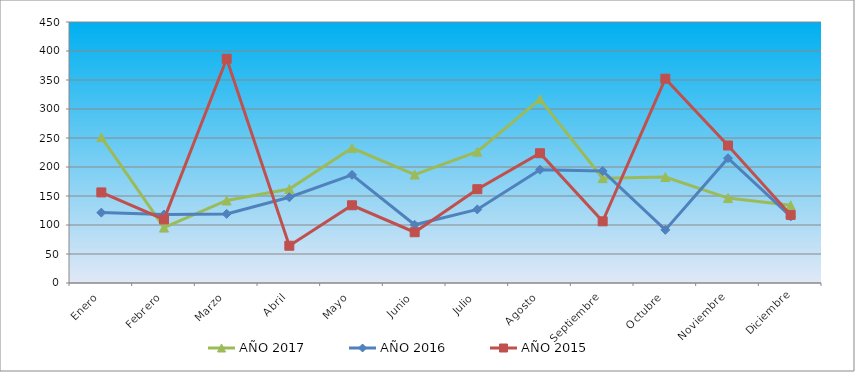
| Category | AÑO 2017 | AÑO 2016 | AÑO 2015 |
|---|---|---|---|
| Enero | 251.343 | 121.356 | 156.183 |
| Febrero | 95.552 | 118.046 | 109.66 |
| Marzo | 142.289 | 119.149 | 386.58 |
| Abril | 162.023 | 147.833 | 64.245 |
| Mayo | 232.648 | 186.447 | 134.029 |
| Junio | 186.95 | 100.394 | 87.507 |
| Julio | 226.417 | 126.872 | 161.721 |
| Agosto | 316.776 | 195.272 | 223.751 |
| Septiembre | 180.718 | 193.066 | 106.337 |
| Octubre | 182.795 | 91.568 | 352.242 |
| Noviembre | 146.444 | 215.131 | 237.043 |
| Diciembre | 133.981 | 114.736 | 117.414 |